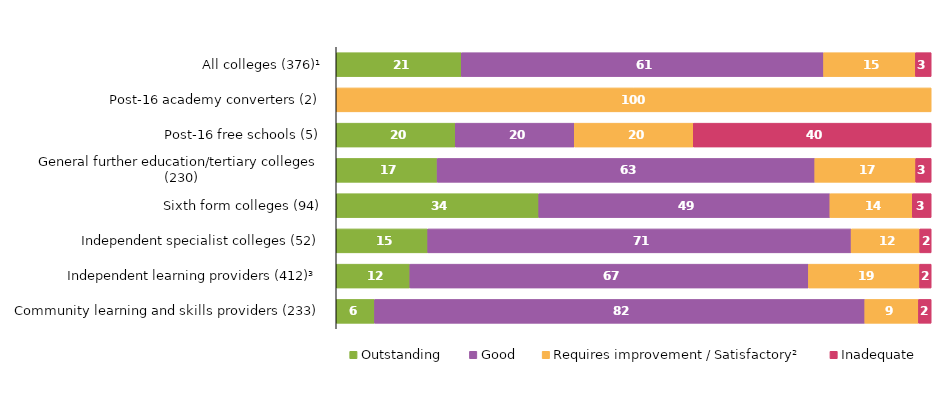
| Category | Outstanding | Good | Requires improvement / Satisfactory² | Inadequate |
|---|---|---|---|---|
| All colleges (376)¹ | 21.011 | 60.904 | 15.426 | 2.66 |
| Post-16 academy converters (2) | 0 | 0 | 100 | 0 |
| Post-16 free schools (5) | 20 | 20 | 20 | 40 |
| General further education/tertiary colleges (230) | 16.957 | 63.478 | 16.957 | 2.609 |
| Sixth form colleges (94) | 34.043 | 48.936 | 13.83 | 3.191 |
| Independent specialist colleges (52) | 15.385 | 71.154 | 11.538 | 1.923 |
| Independent learning providers (412)³ | 12.379 | 66.99 | 18.689 | 1.942 |
| Community learning and skills providers (233) | 6.438 | 82.403 | 9.013 | 2.146 |